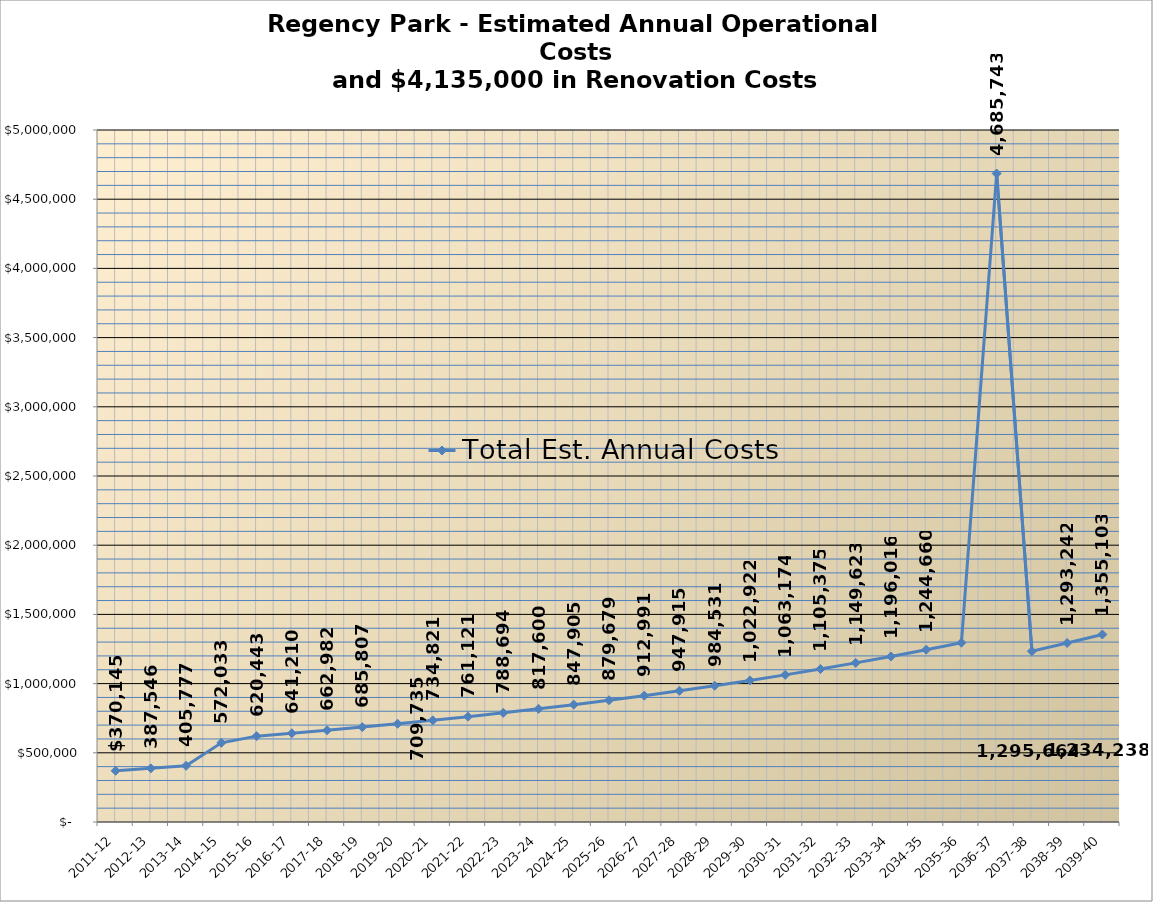
| Category | Total Est. Annual Costs |
|---|---|
| 2011-12 | 370145 |
| 2012-13 | 387545.52 |
| 2013-14 | 405777.33 |
| 2014-15 | 572032.64 |
| 2015-16 | 620442.621 |
| 2016-17 | 641209.504 |
| 2017-18 | 662981.681 |
| 2018-19 | 685806.811 |
| 2019-20 | 709734.932 |
| 2020-21 | 734820.577 |
| 2021-22 | 761120.896 |
| 2022-23 | 788693.789 |
| 2023-24 | 817600.036 |
| 2024-25 | 847905.443 |
| 2025-26 | 879678.988 |
| 2026-27 | 912990.979 |
| 2027-28 | 947915.22 |
| 2028-29 | 984531.176 |
| 2029-30 | 1022922.164 |
| 2030-31 | 1063173.533 |
| 2031-32 | 1105374.87 |
| 2032-33 | 1149623.204 |
| 2033-34 | 1196016.23 |
| 2034-35 | 1244659.533 |
| 2035-36 | 1295663.837 |
| 2036-37 | 4685743.251 |
| 2037-38 | 1234237.539 |
| 2038-39 | 1293242.4 |
| 2039-40 | 1355102.759 |